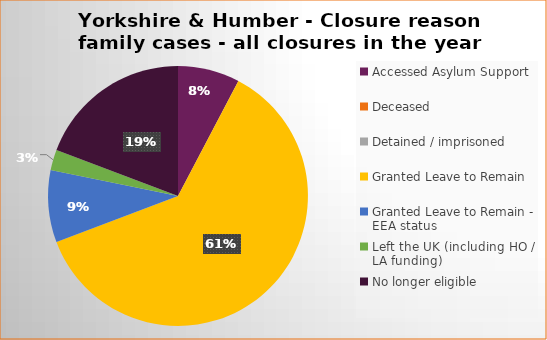
| Category | Total | Percentage |
|---|---|---|
| Accessed Asylum Support | 6 | 0.077 |
| Deceased | 0 | 0 |
| Detained / imprisoned | 0 | 0 |
| Granted Leave to Remain | 48 | 0.61 |
| Granted Leave to Remain - EEA status | 7 | 0.09 |
| Left the UK (including HO / LA funding)  | 2 | 0.026 |
| No longer eligible | 15 | 0.192 |